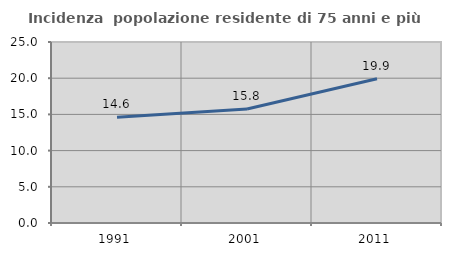
| Category | Incidenza  popolazione residente di 75 anni e più |
|---|---|
| 1991.0 | 14.623 |
| 2001.0 | 15.753 |
| 2011.0 | 19.929 |